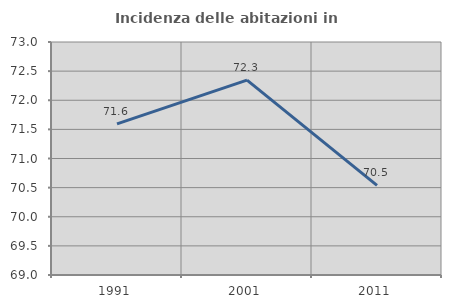
| Category | Incidenza delle abitazioni in proprietà  |
|---|---|
| 1991.0 | 71.595 |
| 2001.0 | 72.345 |
| 2011.0 | 70.54 |